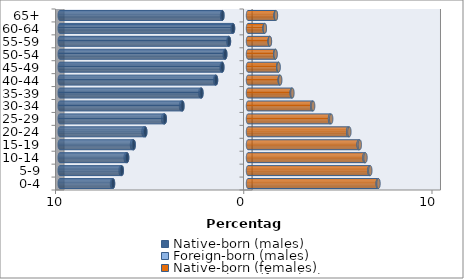
| Category | Native-born (males) | Foreign-born (males) | Native-born (females) | Foreign-born (females) |
|---|---|---|---|---|
| 0-4 | -7.171 | -0.053 | 6.893 | 0.04 |
| 5-9 | -6.705 | -0.064 | 6.45 | 0.047 |
| 10-14 | -6.422 | -0.075 | 6.19 | 0.053 |
| 15-19 | -6.073 | -0.088 | 5.879 | 0.061 |
| 20-24 | -5.458 | -0.093 | 5.322 | 0.064 |
| 25-29 | -4.421 | -0.086 | 4.359 | 0.06 |
| 30-34 | -3.484 | -0.074 | 3.41 | 0.051 |
| 35-39 | -2.474 | -0.058 | 2.323 | 0.038 |
| 40-44 | -1.699 | -0.044 | 1.686 | 0.027 |
| 45-49 | -1.365 | -0.035 | 1.606 | 0.02 |
| 50-54 | -1.208 | -0.03 | 1.447 | 0.017 |
| 55-59 | -1.012 | -0.026 | 1.151 | 0.016 |
| 60-64 | -0.795 | -0.021 | 0.88 | 0.015 |
| 65+ | -1.36 | -0.019 | 1.468 | 0.018 |